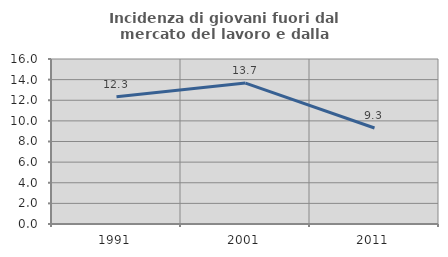
| Category | Incidenza di giovani fuori dal mercato del lavoro e dalla formazione  |
|---|---|
| 1991.0 | 12.347 |
| 2001.0 | 13.665 |
| 2011.0 | 9.309 |